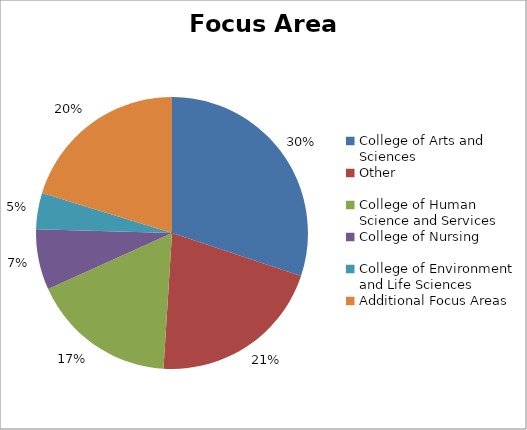
| Category | Series 0 |
|---|---|
| College of Arts and Sciences | 982 |
| Other | 681 |
| College of Human Science and Services | 562 |
| College of Nursing | 235 |
| College of Environment and Life Sciences | 141 |
| Additional Focus Areas | 660 |